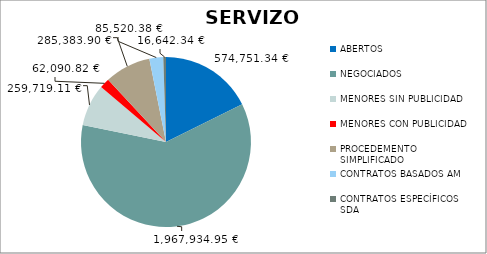
| Category | Series 0 |
|---|---|
| ABERTOS  | 574751.34 |
| NEGOCIADOS  | 1967934.95 |
| MENORES SIN PUBLICIDAD | 259719.11 |
| MENORES CON PUBLICIDAD | 62090.82 |
| PROCEDEMENTO SIMPLIFICADO | 285383.9 |
| CONTRATOS BASADOS AM | 85520.38 |
| CONTRATOS ESPECÍFICOS SDA | 16642.34 |